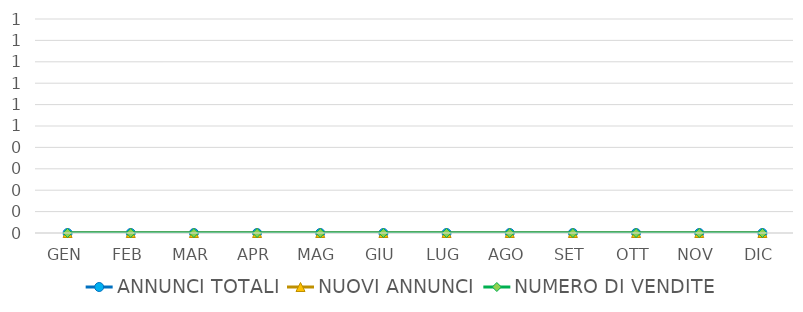
| Category | ANNUNCI TOTALI | NUOVI ANNUNCI | NUMERO DI VENDITE |
|---|---|---|---|
| GEN | 0 | 0 | 0 |
| FEB | 0 | 0 | 0 |
| MAR | 0 | 0 | 0 |
| APR | 0 | 0 | 0 |
| MAG | 0 | 0 | 0 |
| GIU | 0 | 0 | 0 |
| LUG | 0 | 0 | 0 |
| AGO | 0 | 0 | 0 |
| SET | 0 | 0 | 0 |
| OTT | 0 | 0 | 0 |
| NOV | 0 | 0 | 0 |
| DIC | 0 | 0 | 0 |